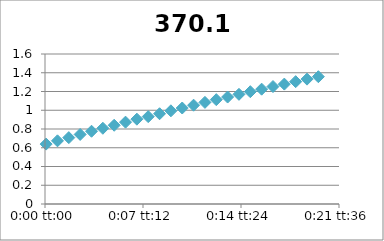
| Category | 370.1 |
|---|---|
| 5.78703703703704e-05 | 0.639 |
| 0.000636574074074074 | 0.674 |
| 0.00121527777777778 | 0.708 |
| 0.00179398148148148 | 0.742 |
| 0.00237268518518518 | 0.776 |
| 0.00295138888888889 | 0.808 |
| 0.00353009259259259 | 0.84 |
| 0.0041087962962963 | 0.873 |
| 0.0046875 | 0.905 |
| 0.0052662037037037 | 0.932 |
| 0.00584490740740741 | 0.963 |
| 0.00642361111111111 | 0.994 |
| 0.00700231481481481 | 1.024 |
| 0.00758101851851852 | 1.054 |
| 0.00815972222222222 | 1.084 |
| 0.00873842592592592 | 1.113 |
| 0.00931712962962963 | 1.141 |
| 0.00989583333333333 | 1.17 |
| 0.010474537037037 | 1.198 |
| 0.0110532407407407 | 1.225 |
| 0.0116319444444444 | 1.253 |
| 0.0122106481481481 | 1.279 |
| 0.0127893518518518 | 1.305 |
| 0.0133680555555556 | 1.332 |
| 0.0139467592592593 | 1.358 |